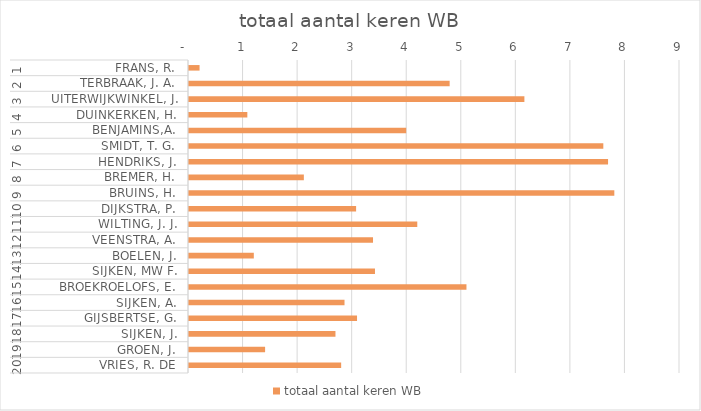
| Category | totaal aantal keren WB |
|---|---|
| 0 | 0.194 |
| 1 | 4.778 |
| 2 | 6.148 |
| 3 | 1.069 |
| 4 | 3.981 |
| 5 | 7.594 |
| 6 | 7.681 |
| 7 | 2.105 |
| 8 | 7.796 |
| 9 | 3.063 |
| 10 | 4.184 |
| 11 | 3.373 |
| 12 | 1.188 |
| 13 | 3.409 |
| 14 | 5.086 |
| 15 | 2.851 |
| 16 | 3.08 |
| 17 | 2.685 |
| 18 | 1.395 |
| 19 | 2.789 |